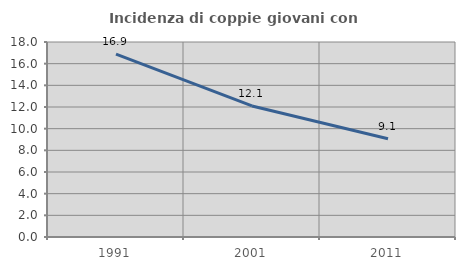
| Category | Incidenza di coppie giovani con figli |
|---|---|
| 1991.0 | 16.88 |
| 2001.0 | 12.098 |
| 2011.0 | 9.065 |